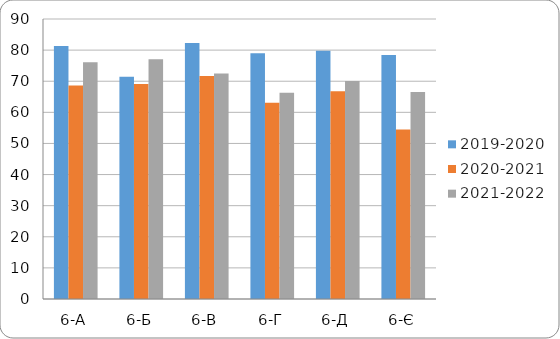
| Category | 2019-2020 | 2020-2021 | 2021-2022 |
|---|---|---|---|
| 6-А | 81.3 | 68.6 | 76.1 |
| 6-Б | 71.4 | 69.1 | 77.1 |
| 6-В | 82.3 | 71.7 | 72.5 |
| 6-Г | 79 | 63.1 | 66.3 |
| 6-Д | 79.8 | 66.8 | 70.1 |
| 6-Є | 78.4 | 54.5 | 66.5 |